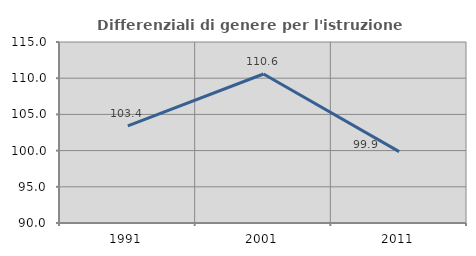
| Category | Differenziali di genere per l'istruzione superiore |
|---|---|
| 1991.0 | 103.422 |
| 2001.0 | 110.581 |
| 2011.0 | 99.854 |